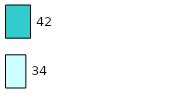
| Category | Series 0 | Series 1 |
|---|---|---|
| 0 | 34 | 42 |